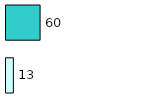
| Category | Series 0 | Series 1 |
|---|---|---|
| 0 | 13 | 60 |